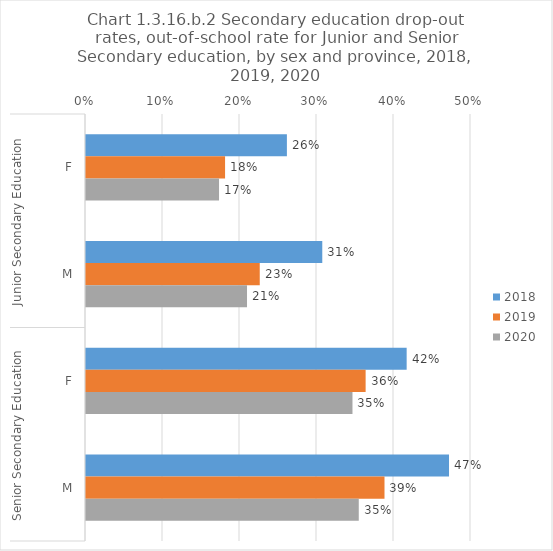
| Category | 2018 | 2019 | 2020 |
|---|---|---|---|
| 0 | 0.261 | 0.181 | 0.173 |
| 1 | 0.307 | 0.226 | 0.209 |
| 2 | 0.416 | 0.363 | 0.346 |
| 3 | 0.471 | 0.388 | 0.354 |